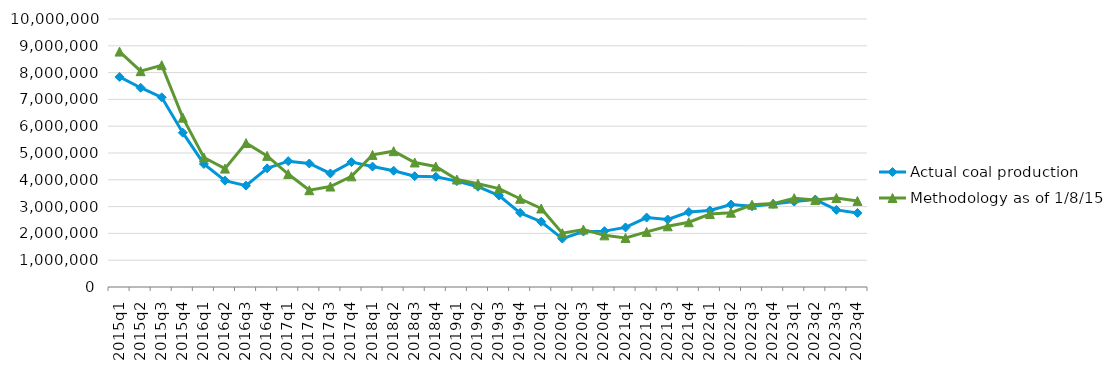
| Category | Actual coal production | Methodology as of 1/8/15 |
|---|---|---|
| 2015q1 | 7839747 | 8784333 |
| 2015q2 | 7435218 | 8053450 |
| 2015q3 | 7077100 | 8276408 |
| 2015q4 | 5757547 | 6319699 |
| 2016q1 | 4593943 | 4833171 |
| 2016q2 | 3969126 | 4417796 |
| 2016q3 | 3781495 | 5370797 |
| 2016q4 | 4427322 | 4892809 |
| 2017q1 | 4695343 | 4215075 |
| 2017q2 | 4608528 | 3611415 |
| 2017q3 | 4236612 | 3748601 |
| 2017q4 | 4661174 | 4128763 |
| 2018q1 | 4493401 | 4929358 |
| 2018q2 | 4338382 | 5068259 |
| 2018q3 | 4135298 | 4646439 |
| 2018q4 | 4113957 | 4495854 |
| 2019q1 | 3951992 | 4011493 |
| 2019q2 | 3742253 | 3854051 |
| 2019q3 | 3411012 | 3673168 |
| 2019q4 | 2766029 | 3292345 |
| 2020q1 | 2435250 | 2930156 |
| 2020q2 | 1806044 | 2008113 |
| 2020q3 | 2067873 | 2142250 |
| 2020q4 | 2084826 | 1927198 |
| 2021q1 | 2223026 | 1829281 |
| 2021q2 | 2591044 | 2056271 |
| 2021q3 | 2517700 | 2266084 |
| 2021q4 | 2797833 | 2416589 |
| 2022q1 | 2857296 | 2724610 |
| 2022q2 | 3080005 | 2773241 |
| 2022q3 | 3011448 | 3069619 |
| 2022q4 | 3098765 | 3112758 |
| 2023q1 | 3188408 | 3314430 |
| 2023q2 | 3263802 | 3248759 |
| 2023q3 | 2877333 | 3321350 |
| 2023q4 | 2764335 | 3211796 |